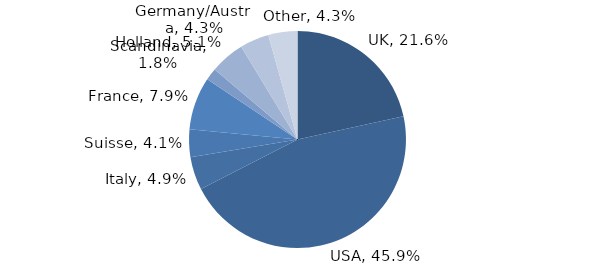
| Category | Investment Style |
|---|---|
| UK | 0.216 |
| USA | 0.459 |
| Italy | 0.049 |
| Suisse | 0.041 |
| France | 0.079 |
| Scandinavia | 0.018 |
| Holland | 0.051 |
| Germany/Austria | 0.043 |
| Other | 0.043 |